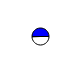
| Category | Series 0 |
|---|---|
| 0 | 2870428 |
| 1 | 2911534 |